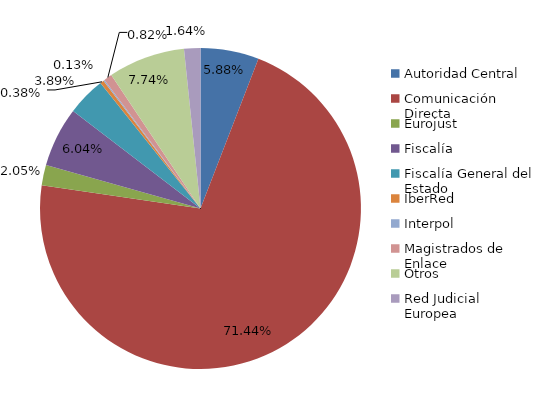
| Category | Comisiones Rogatorias |
|---|---|
| Autoridad Central | 186 |
| Comunicación Directa | 2261 |
| Eurojust | 65 |
| Fiscalía | 191 |
| Fiscalía General del Estado | 123 |
| IberRed | 12 |
| Interpol | 4 |
| Magistrados de Enlace | 26 |
| Otros | 245 |
| Red Judicial Europea | 52 |